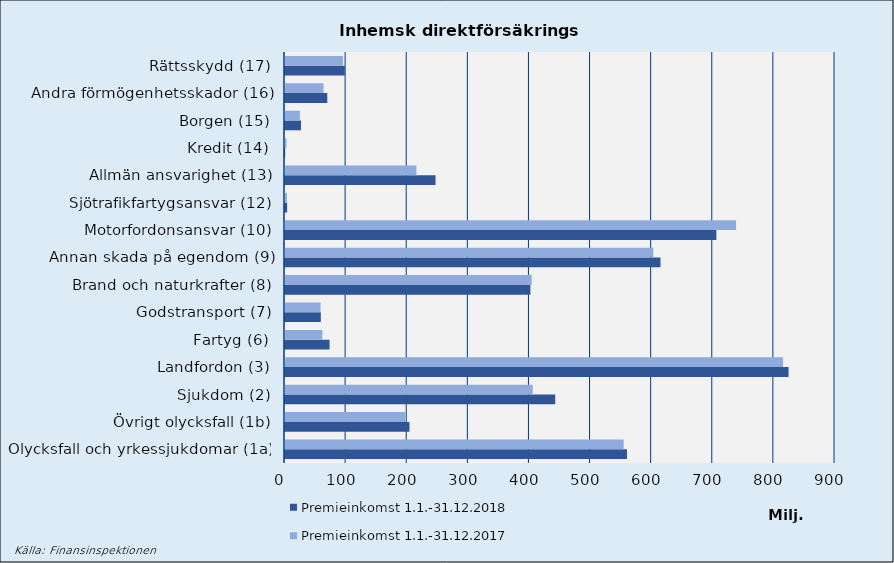
| Category | Premieinkomst |
|---|---|
| Olycksfall och yrkessjukdomar (1a) | 554225.637 |
| Övrigt olycksfall (1b) | 196846.354 |
| Sjukdom (2) | 405364.067 |
| Landfordon (3) | 814938.211 |
| Fartyg (6) | 61117.599 |
| Godstransport (7) | 58074.63 |
| Brand och naturkrafter (8) | 403686.09 |
| Annan skada på egendom (9) | 602744.738 |
| Motorfordonsansvar (10) | 738080.982 |
| Sjötrafikfartygsansvar (12) | 3152.309 |
| Allmän ansvarighet (13) | 215008.232 |
| Kredit (14) | 2376.358 |
| Borgen (15) | 24324.75 |
| Andra förmögenhetsskador (16) | 63027.609 |
| Rättsskydd (17) | 94921.496 |